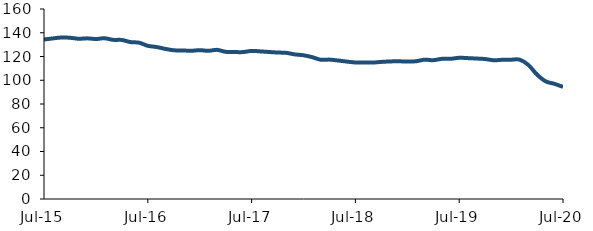
| Category | Series 0 |
|---|---|
| 2015-07-01 | 134.28 |
| 2015-08-01 | 135.22 |
| 2015-09-01 | 135.986 |
| 2015-10-01 | 135.789 |
| 2015-11-01 | 134.951 |
| 2015-12-01 | 135.276 |
| 2016-01-01 | 134.733 |
| 2016-02-01 | 135.356 |
| 2016-03-01 | 134.015 |
| 2016-04-01 | 133.922 |
| 2016-05-01 | 132.141 |
| 2016-06-01 | 131.623 |
| 2016-07-01 | 128.99 |
| 2016-08-01 | 128.015 |
| 2016-09-01 | 126.449 |
| 2016-10-01 | 125.24 |
| 2016-11-01 | 125.098 |
| 2016-12-01 | 124.805 |
| 2017-01-01 | 125.34 |
| 2017-02-01 | 124.77 |
| 2017-03-01 | 125.585 |
| 2017-04-01 | 123.952 |
| 2017-05-01 | 123.751 |
| 2017-06-01 | 123.726 |
| 2017-07-01 | 124.701 |
| 2017-08-01 | 124.311 |
| 2017-09-01 | 123.815 |
| 2017-10-01 | 123.341 |
| 2017-11-01 | 123.064 |
| 2017-12-01 | 121.768 |
| 2018-01-01 | 121.036 |
| 2018-02-01 | 119.444 |
| 2018-03-01 | 117.258 |
| 2018-04-01 | 117.381 |
| 2018-05-01 | 116.619 |
| 2018-06-01 | 115.72 |
| 2018-07-01 | 114.964 |
| 2018-08-01 | 114.93 |
| 2018-09-01 | 114.902 |
| 2018-10-01 | 115.453 |
| 2018-11-01 | 115.838 |
| 2018-12-01 | 115.968 |
| 2019-01-01 | 115.731 |
| 2019-02-01 | 115.981 |
| 2019-03-01 | 117.335 |
| 2019-04-01 | 116.879 |
| 2019-05-01 | 118.056 |
| 2019-06-01 | 118.059 |
| 2019-07-01 | 118.921 |
| 2019-08-01 | 118.635 |
| 2019-09-01 | 118.287 |
| 2019-10-01 | 117.85 |
| 2019-11-01 | 116.835 |
| 2019-12-01 | 117.224 |
| 2020-01-01 | 117.309 |
| 2020-02-01 | 117.318 |
| 2020-03-01 | 112.843 |
| 2020-04-01 | 104.749 |
| 2020-05-01 | 99.065 |
| 2020-06-01 | 97 |
| 2020-07-01 | 94.4 |